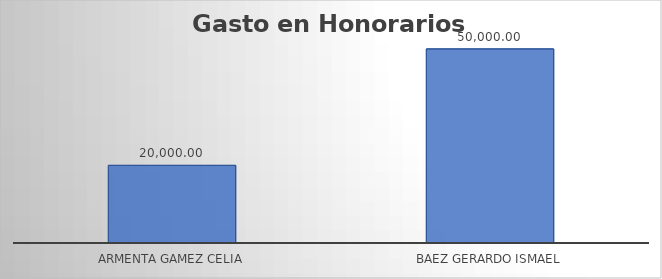
| Category | Monto  |
|---|---|
| ARMENTA GAMEZ CELIA | 20000 |
| BAEZ GERARDO ISMAEL | 50000 |